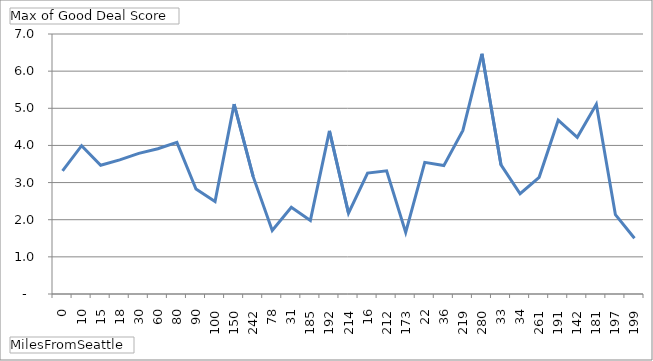
| Category | Total |
|---|---|
| 0 | 3.314 |
| 10 | 3.993 |
| 15 | 3.465 |
| 18 | 3.612 |
| 30 | 3.787 |
| 60 | 3.911 |
| 80 | 4.084 |
| 90 | 2.828 |
| 100 | 2.491 |
| 150 | 5.112 |
| 242 | 3.159 |
| 78 | 1.712 |
| 31 | 2.336 |
| 185 | 1.981 |
| 192 | 4.391 |
| 214 | 2.176 |
| 16 | 3.255 |
| 212 | 3.315 |
| 173 | 1.659 |
| 22 | 3.544 |
| 36 | 3.457 |
| 219 | 4.406 |
| 280 | 6.468 |
| 33 | 3.475 |
| 34 | 2.7 |
| 261 | 3.142 |
| 191 | 4.679 |
| 142 | 4.219 |
| 181 | 5.107 |
| 197 | 2.134 |
| 199 | 1.502 |